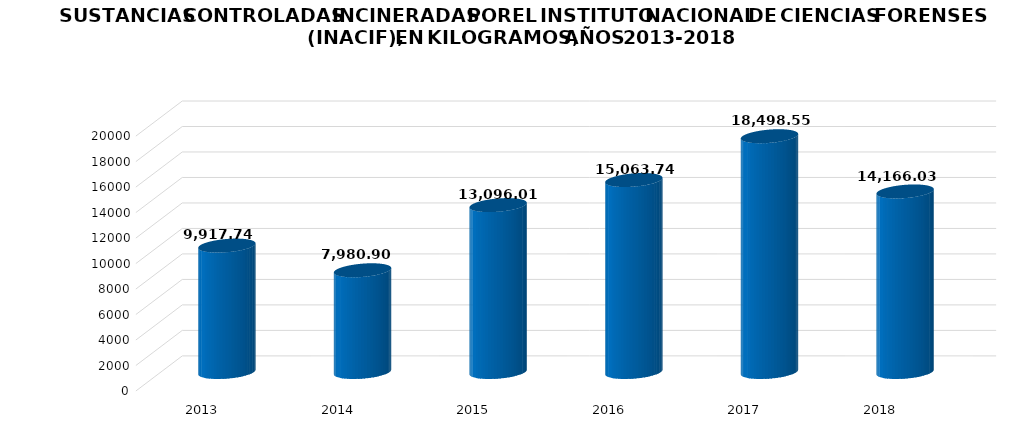
| Category | Series 1 |
|---|---|
| 2013.0 | 9917.741 |
| 2014.0 | 7980.903 |
| 2015.0 | 13096.017 |
| 2016.0 | 15063.741 |
| 2017.0 | 18498.553 |
| 2018.0 | 14166.035 |